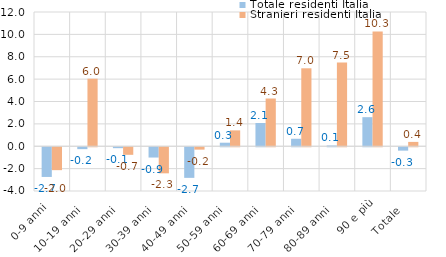
| Category | Totale residenti | Stranieri residenti |
|---|---|---|
| 0-9 anni   | -2.655 | -2.047 |
| 10-19 anni   | -0.17 | 6.039 |
| 20-29 anni   | -0.082 | -0.677 |
| 30-39 anni   | -0.92 | -2.331 |
| 40-49 anni   | -2.736 | -0.213 |
| 50-59 anni   | 0.317 | 1.42 |
| 60-69 anni   | 2.077 | 4.268 |
| 70-79 anni   | 0.669 | 6.968 |
| 80-89 anni   | 0.071 | 7.482 |
| 90 e più | 2.599 | 10.267 |
| Totale   | -0.304 | 0.388 |